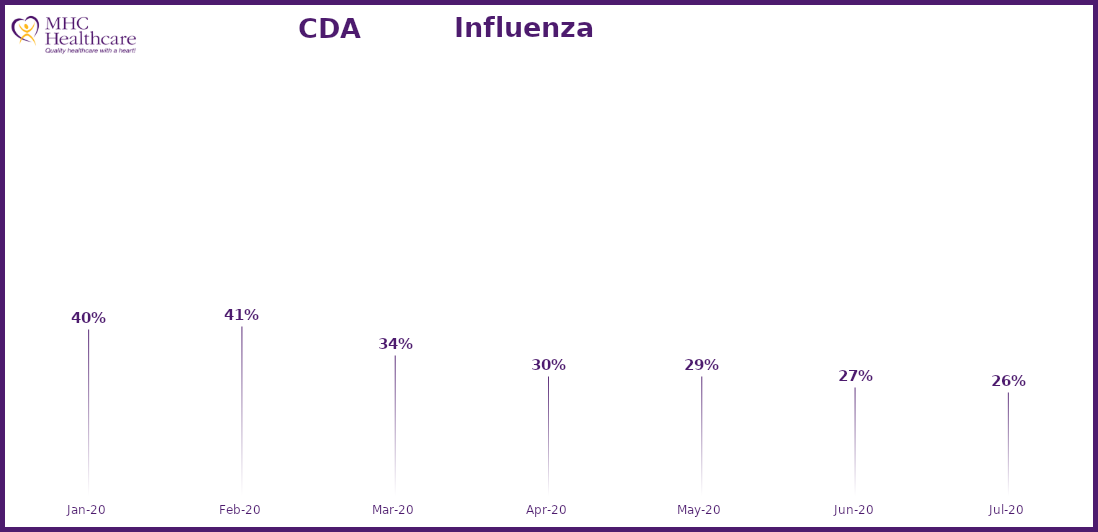
| Category | Online Access to Health Information |
|---|---|
| 2020-01-01 | 0.401 |
| 2020-02-01 | 0.407 |
| 2020-03-01 | 0.341 |
| 2020-04-01 | 0.296 |
| 2020-05-01 | 0.294 |
| 2020-06-01 | 0.271 |
| 2020-07-01 | 0.258 |